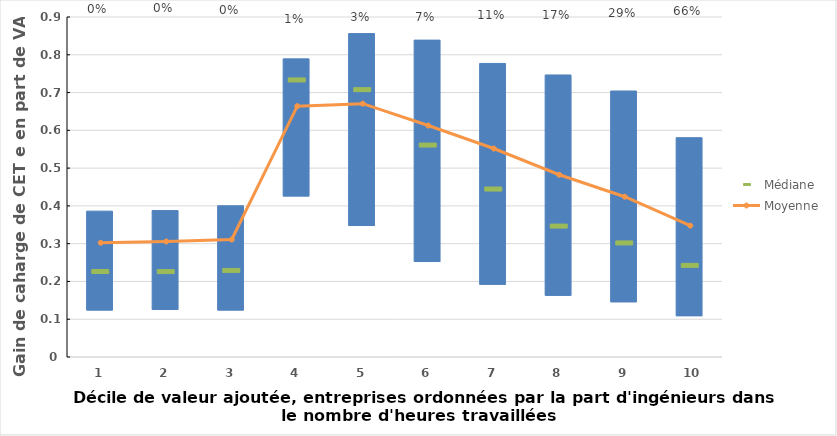
| Category | lower | upper |
|---|---|---|
| 1.0 | 0.123 | 0.263 |
| 2.0 | 0.125 | 0.263 |
| 3.0 | 0.123 | 0.277 |
| 4.0 | 0.425 | 0.364 |
| 5.0 | 0.347 | 0.509 |
| 6.0 | 0.251 | 0.587 |
| 7.0 | 0.191 | 0.586 |
| 8.0 | 0.162 | 0.585 |
| 9.0 | 0.145 | 0.559 |
| 10.0 | 0.108 | 0.472 |